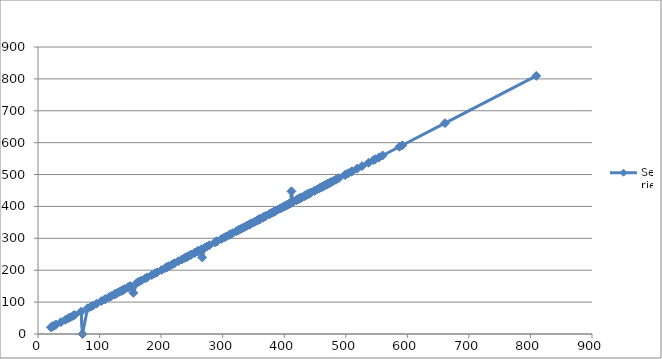
| Category | Series 0 |
|---|---|
| 809.49 | 809.49 |
| 661.23 | 661.23 |
| 591.78 | 591.78 |
| 587.2 | 587.2 |
| 559.8 | 559.8 |
| 554.0 | 554 |
| 548.0 | 548 |
| 545.04 | 545.04 |
| 537.0 | 537 |
| 526.3 | 526.3 |
| 518.51 | 518.51 |
| 510.2 | 510.2 |
| 508.8 | 508.8 |
| 503.85 | 503.85 |
| 498.96 | 498.96 |
| 498.96 | 498.96 |
| 488.75 | 488.75 |
| 484.0 | 484 |
| 484.0 | 484 |
| 479.7 | 479.7 |
| 475.8 | 475.8 |
| 475.8 | 475.8 |
| 474.0 | 474 |
| 474.0 | 474 |
| 470.8 | 470.8 |
| 470.7 | 470.7 |
| 469.95 | 469.95 |
| 467.4 | 467.4 |
| 466.14 | 466.14 |
| 464.1 | 464.1 |
| 464.1 | 464.1 |
| 461.8 | 461.8 |
| 460.8 | 460.8 |
| 459.0 | 459 |
| 457.4 | 457.4 |
| 456.16 | 456.16 |
| 453.24 | 453.24 |
| 449.25 | 449.25 |
| 449.0 | 449 |
| 443.66 | 443.66 |
| 442.4 | 442.4 |
| 439.68 | 439.68 |
| 439.68 | 439.68 |
| 438.56 | 438.56 |
| 438.45 | 438.45 |
| 438.45 | 438.45 |
| 435.9 | 435.9 |
| 434.8 | 434.8 |
| 433.98 | 433.98 |
| 433.44 | 433.44 |
| 433.2 | 433.2 |
| 432.0 | 432 |
| 428.4 | 428.4 |
| 427.65 | 427.65 |
| 427.65 | 427.65 |
| 426.0 | 426 |
| 426.0 | 426 |
| 426.0 | 426 |
| 424.35 | 424.35 |
| 422.64 | 422.64 |
| 422.2 | 422.2 |
| 420.14 | 420.14 |
| 419.4 | 419.4 |
| 414.2 | 414.2 |
| 411.7 | 447.5 |
| 411.0 | 411 |
| 410.25 | 410.25 |
| 410.25 | 410.25 |
| 407.7 | 407.7 |
| 407.54 | 407.54 |
| 404.7 | 404.7 |
| 403.92 | 403.92 |
| 402.75 | 402.75 |
| 401.6 | 401.6 |
| 400.2 | 400.2 |
| 398.16 | 398.16 |
| 395.36 | 395.36 |
| 393.48 | 393.48 |
| 390.12 | 390.12 |
| 386.24 | 386.24 |
| 385.8 | 385.8 |
| 383.04 | 383.04 |
| 383.04 | 383.04 |
| 382.14 | 382.14 |
| 379.5 | 379.5 |
| 376.32 | 376.32 |
| 376.32 | 376.32 |
| 375.8 | 375.8 |
| 370.65 | 370.65 |
| 368.85 | 368.85 |
| 367.35 | 367.35 |
| 365.7 | 365.7 |
| 365.7 | 365.7 |
| 360.9 | 360.9 |
| 360.08 | 360.08 |
| 359.84 | 359.84 |
| 359.84 | 359.84 |
| 357.75 | 357.75 |
| 357.0 | 357 |
| 355.68 | 355.68 |
| 355.55 | 355.55 |
| 352.52 | 352.52 |
| 352.52 | 352.52 |
| 349.76 | 349.76 |
| 346.56 | 346.56 |
| 345.0 | 345 |
| 344.28 | 344.28 |
| 343.84 | 343.84 |
| 340.44 | 340.44 |
| 338.0 | 338 |
| 334.74 | 334.74 |
| 331.8 | 331.8 |
| 328.8 | 328.8 |
| 325.92 | 325.92 |
| 325.08 | 325.08 |
| 322.2 | 322.2 |
| 316.0 | 316 |
| 312.34 | 312.34 |
| 311.52 | 311.52 |
| 310.5 | 310.5 |
| 306.02 | 306.02 |
| 302.8 | 302.8 |
| 298.22 | 298.22 |
| 290.76 | 290.76 |
| 290.08 | 290.08 |
| 289.32 | 289.32 |
| 287.54 | 287.54 |
| 278.46 | 278.46 |
| 274.44 | 274.44 |
| 270.9 | 270.9 |
| 266.8 | 240.12 |
| 265.44 | 265.44 |
| 260.16 | 260.16 |
| 260.08 | 260.08 |
| 258.24 | 258.24 |
| 254.4 | 254.4 |
| 254.4 | 254.4 |
| 248.67 | 248.67 |
| 248.4 | 248.4 |
| 244.32 | 244.32 |
| 241.92 | 241.92 |
| 240.12 | 240.12 |
| 237.6 | 237.6 |
| 233.5 | 233.5 |
| 228.08 | 228.08 |
| 221.9 | 221.9 |
| 220.41 | 220.41 |
| 216.58 | 216.58 |
| 212.6 | 212.6 |
| 209.76 | 209.76 |
| 209.34 | 209.34 |
| 206.4 | 206.4 |
| 200.79 | 200.79 |
| 193.12 | 193.12 |
| 189.6 | 189.6 |
| 184.8 | 184.8 |
| 177.44 | 177.44 |
| 174.33 | 174.33 |
| 168.0 | 168 |
| 164.1 | 164.1 |
| 161.1 | 161.1 |
| 154.98 | 129.15 |
| 150.15 | 150.15 |
| 148.4 | 148.4 |
| 146.56 | 146.56 |
| 146.16 | 146.16 |
| 146.16 | 146.16 |
| 140.94 | 140.94 |
| 138.58 | 138.58 |
| 138.54 | 138.54 |
| 135.72 | 135.72 |
| 135.45 | 135.45 |
| 132.3 | 132.3 |
| 128.8 | 128.8 |
| 126.28 | 126.28 |
| 125.28 | 125.28 |
| 124.32 | 124.32 |
| 118.95 | 118.95 |
| 115.75 | 115.75 |
| 109.92 | 109.92 |
| 108.36 | 108.36 |
| 103.04 | 103.04 |
| 95.16 | 95.16 |
| 88.92 | 88.92 |
| 85.53 | 85.53 |
| 80.55 | 80.55 |
| 72.33 | 0 |
| 70.05 | 70.05 |
| 59.24 | 59.24 |
| 56.37 | 56.37 |
| 51.92 | 51.92 |
| 49.18 | 49.18 |
| 44.38 | 44.38 |
| 37.31 | 37.31 |
| 29.36 | 29.36 |
| 27.35 | 27.35 |
| 24.49 | 24.49 |
| 23.91 | 23.91 |
| 22.12 | 22.12 |
| 21.04 | 21.04 |